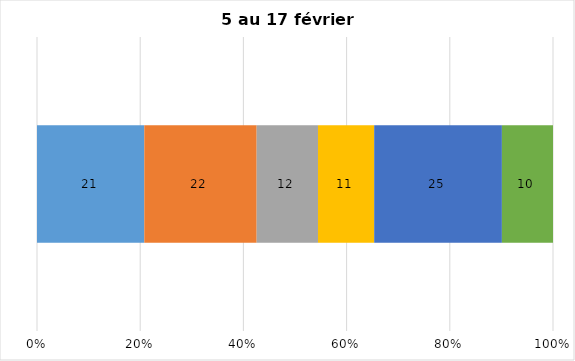
| Category | Plusieurs fois par jour | Une fois par jour | Quelques fois par semaine   | Une fois par semaine ou moins   |  Jamais   |  Je n’utilise pas les médias sociaux |
|---|---|---|---|---|---|---|
| 0 | 21 | 22 | 12 | 11 | 25 | 10 |